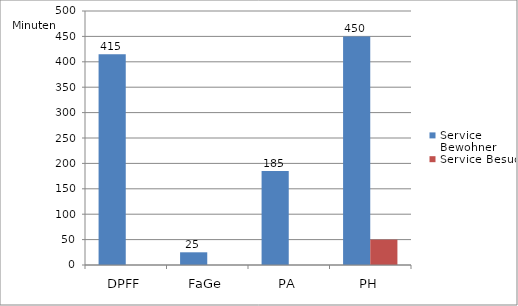
| Category | Service Bewohner | Service Besucher |
|---|---|---|
| DPFF | 415 | 0 |
| FaGe | 25 | 0 |
| PA | 185 | 0 |
| PH | 450 | 50 |